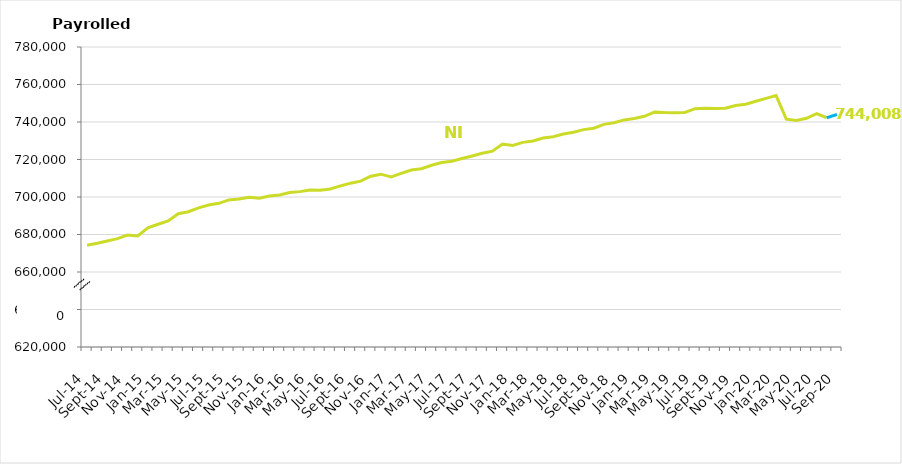
| Category | NI |
|---|---|
| Jul-14 | 674307 |
| Aug-14 | 675324 |
| Sep-14 | 676494 |
| Oct-14 | 677769 |
| Nov-14 | 679713 |
| Dec-14 | 679204 |
| Jan-15 | 683504 |
| Feb-15 | 685454 |
| Mar-15 | 687240 |
| Apr-15 | 691061 |
| May-15 | 692148 |
| Jun-15 | 694235 |
| Jul-15 | 695695 |
| Aug-15 | 696619 |
| Sep-15 | 698447 |
| Oct-15 | 698911 |
| Nov-15 | 699878 |
| Dec-15 | 699359 |
| Jan-16 | 700549 |
| Feb-16 | 701073 |
| Mar-16 | 702362 |
| Apr-16 | 702870 |
| May-16 | 703672 |
| Jun-16 | 703655 |
| Jul-16 | 704273 |
| Aug-16 | 705905 |
| Sep-16 | 707374 |
| Oct-16 | 708453 |
| Nov-16 | 711075 |
| Dec-16 | 712178 |
| Jan-17 | 710712 |
| Feb-17 | 712569 |
| Mar-17 | 714403 |
| Apr-17 | 715116 |
| May-17 | 716927 |
| Jun-17 | 718429 |
| Jul-17 | 719067 |
| Aug-17 | 720555 |
| Sep-17 | 721832 |
| Oct-17 | 723291 |
| Nov-17 | 724458 |
| Dec-17 | 728270 |
| Jan-18 | 727503 |
| Feb-18 | 729138 |
| Mar-18 | 729853 |
| Apr-18 | 731439 |
| May-18 | 732183 |
| Jun-18 | 733607 |
| Jul-18 | 734551 |
| Aug-18 | 735947 |
| Sep-18 | 736708 |
| Oct-18 | 738754 |
| Nov-18 | 739595 |
| Dec-18 | 741112 |
| Jan-19 | 741874 |
| Feb-19 | 743028 |
| Mar-19 | 745265 |
| Apr-19 | 745067 |
| May-19 | 744990 |
| Jun-19 | 745091 |
| Jul-19 | 747128 |
| Aug-19 | 747323 |
| Sep-19 | 747168 |
| Oct-19 | 747302 |
| Nov-19 | 748760 |
| Dec-19 | 749499 |
| Jan-20 | 751058 |
| Feb-20 | 752582 |
| Mar-20 | 754089 |
| Apr-20 | 741519 |
| May-20 | 740838 |
| Jun-20 | 742004 |
| Jul-20 | 744502 |
| Aug-20 | 742271 |
| Sep-20 | 744008 |